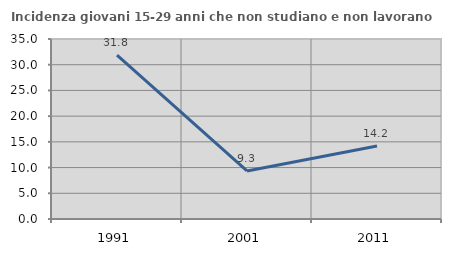
| Category | Incidenza giovani 15-29 anni che non studiano e non lavorano  |
|---|---|
| 1991.0 | 31.843 |
| 2001.0 | 9.339 |
| 2011.0 | 14.208 |